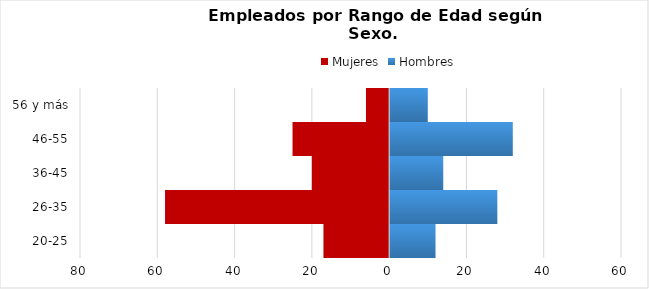
| Category | Mujeres | Hombres |
|---|---|---|
| 20-25 | -17 | 12 |
| 26-35 | -58 | 28 |
| 36-45 | -20 | 14 |
| 46-55 | -25 | 32 |
| 56 y más | -6 | 10 |